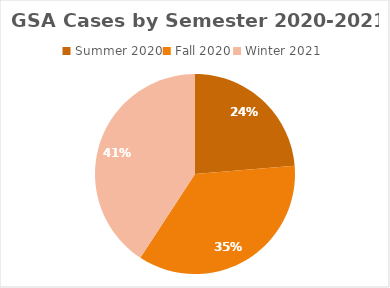
| Category | Series 0 |
|---|---|
| Summer 2020 | 18 |
| Fall 2020 | 27 |
| Winter 2021 | 31 |